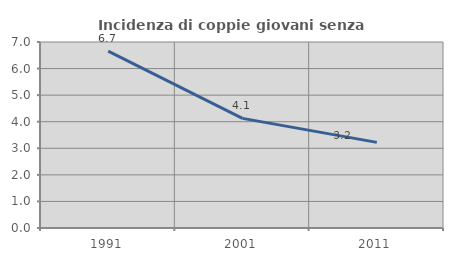
| Category | Incidenza di coppie giovani senza figli |
|---|---|
| 1991.0 | 6.656 |
| 2001.0 | 4.125 |
| 2011.0 | 3.222 |